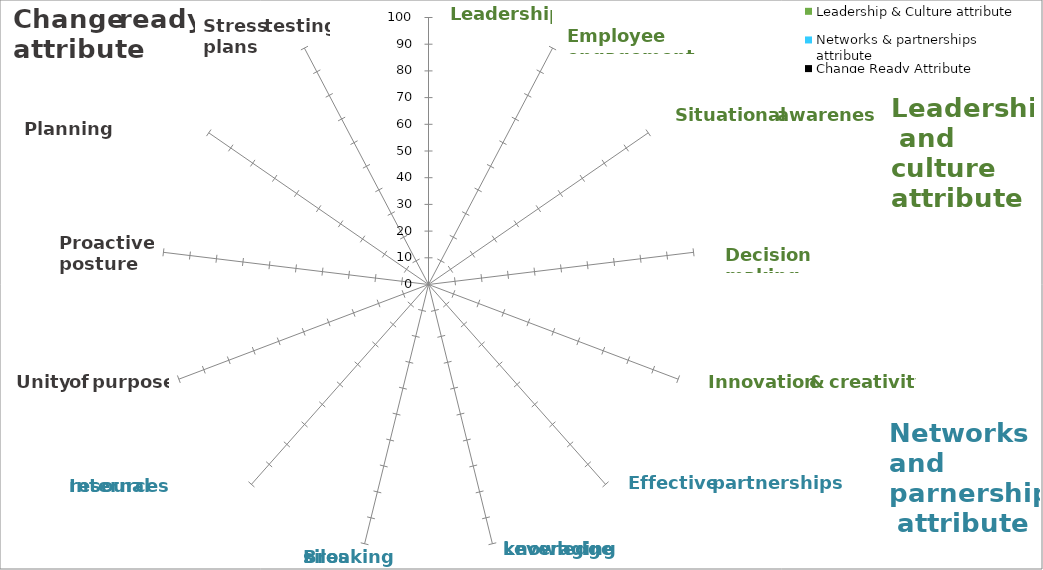
| Category | Leadership & Culture attribute | Networks & partnerships attribute | Change Ready Attribute |
|---|---|---|---|
| 0.0 | 0 | 0 | 0 |
| 0.0 | 0 | 0 | 0 |
| 0.0 | 0 | 0 | 0 |
| 0.0 | 0 | 0 | 0 |
| 0.0 | 0 | 0 | 0 |
| 0.0 | 0 | 0 | 0 |
| 0.0 | 0 | 0 | 0 |
| 0.0 | 0 | 0 | 0 |
| 0.0 | 0 | 0 | 0 |
| 0.0 | 0 | 0 | 0 |
| 0.0 | 0 | 0 | 0 |
| 0.0 | 0 | 0 | 0 |
| 0.0 | 0 | 0 | 0 |